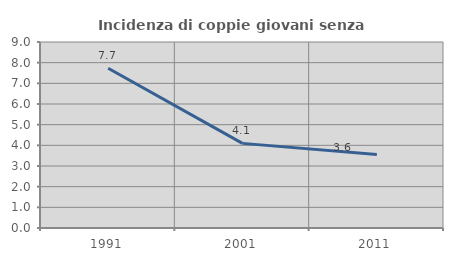
| Category | Incidenza di coppie giovani senza figli |
|---|---|
| 1991.0 | 7.729 |
| 2001.0 | 4.095 |
| 2011.0 | 3.556 |